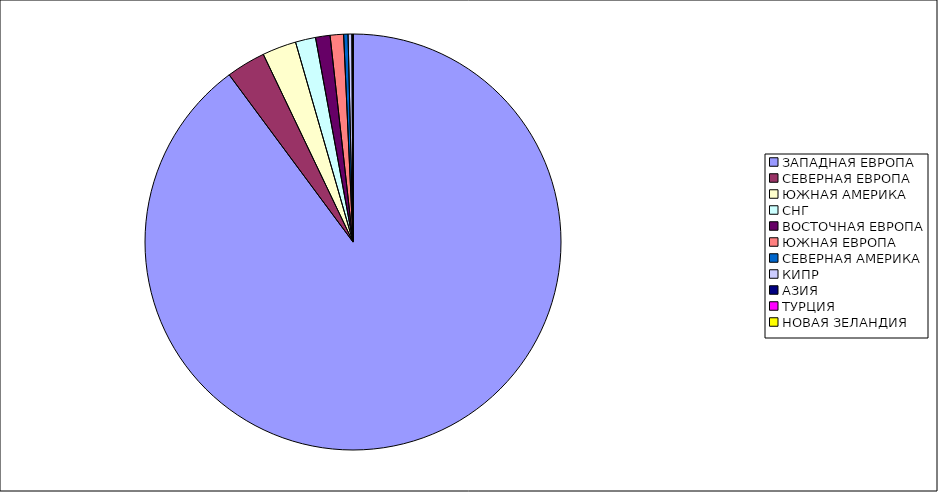
| Category | Оборот |
|---|---|
| ЗАПАДНАЯ ЕВРОПА | 0.899 |
| СЕВЕРНАЯ ЕВРОПА | 0.031 |
| ЮЖНАЯ АМЕРИКА | 0.026 |
| СНГ | 0.016 |
| ВОСТОЧНАЯ ЕВРОПА | 0.011 |
| ЮЖНАЯ ЕВРОПА | 0.01 |
| СЕВЕРНАЯ АМЕРИКА | 0.003 |
| КИПР | 0.003 |
| АЗИЯ | 0.001 |
| ТУРЦИЯ | 0 |
| НОВАЯ ЗЕЛАНДИЯ | 0 |